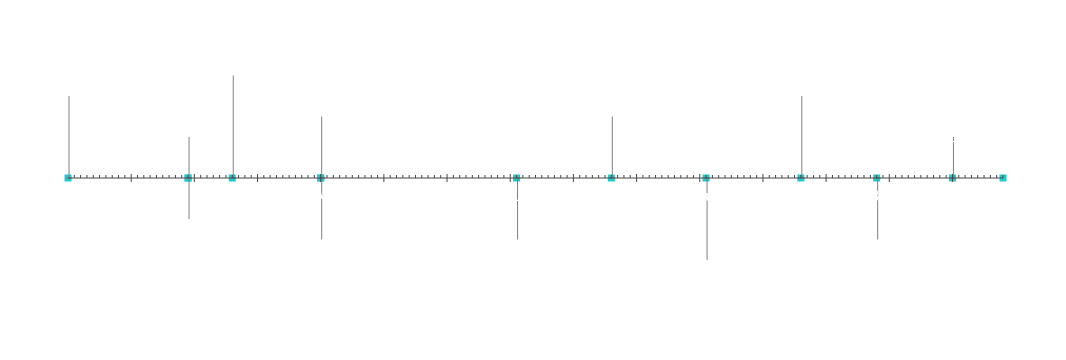
| Category | Vị trí |
|---|---|
| Bắt đầu dự án | 20 |
| Mốc 1 | 10 |
| Mốc 2 | -10 |
| Mốc 3 | 25 |
| Mốc 4 | -15 |
| Mốc 5 | 15 |
| Mốc 6 | -15 |
| Mốc 7 | 15 |
| Mốc 8 | -20 |
| Mốc 9 | 20 |
| Mốc 10 | -15 |
| Mốc 11 | 10 |
| Kết thúc dự án | 5 |